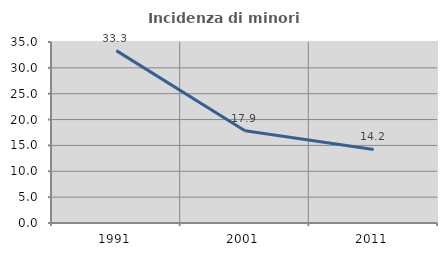
| Category | Incidenza di minori stranieri |
|---|---|
| 1991.0 | 33.333 |
| 2001.0 | 17.857 |
| 2011.0 | 14.218 |